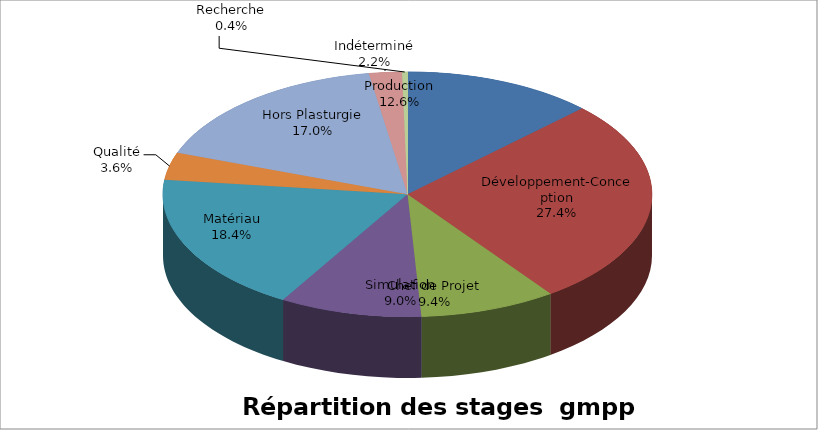
| Category | Series 0 | Series 1 |
|---|---|---|
| Production | 35 | 0.126 |
| Développement-Conception | 76 | 0.274 |
| Simulation | 25 | 0.09 |
| Chef de Projet | 26 | 0.094 |
| Matériau | 51 | 0.184 |
| Qualité | 10 | 0.036 |
| Hors Plasturgie | 47 | 0.17 |
| Indéterminé | 6 | 0.022 |
| Recherche | 1 | 0.004 |